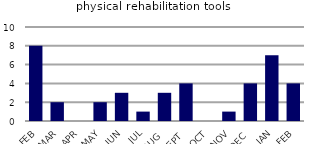
| Category | physical rehabilitation tools |
|---|---|
| FEB | 8 |
| MAR | 2 |
| APR | 0 |
| MAY | 2 |
| JUN | 3 |
| JUL | 1 |
| AUG | 3 |
| SEPT | 4 |
| OCT | 0 |
| NOV | 1 |
| DEC | 4 |
| JAN | 7 |
| FEB | 4 |